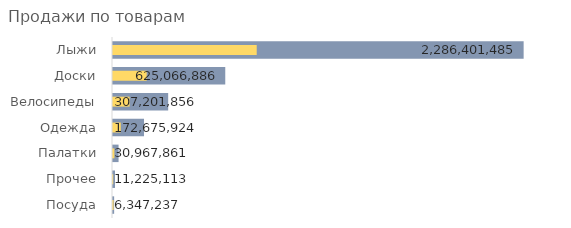
| Category | Сумма по полю Продажи без НДС |
|---|---|
| Посуда | 6347236.525 |
| Прочее | 11225112.924 |
| Палатки | 30967860.593 |
| Одежда | 172675924.153 |
| Велосипеды | 307201855.932 |
| Доски | 625066885.593 |
| Лыжи | 2286401485.424 |